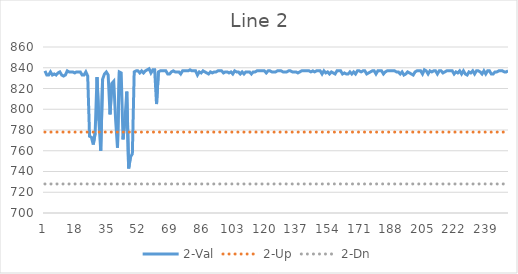
| Category | 2-Val | 2-Up | 2-Dn |
|---|---|---|---|
| 0 | 837 | 778 | 728 |
| 1 | 833 | 778 | 728 |
| 2 | 833 | 778 | 728 |
| 3 | 836 | 778 | 728 |
| 4 | 833 | 778 | 728 |
| 5 | 834 | 778 | 728 |
| 6 | 833 | 778 | 728 |
| 7 | 835 | 778 | 728 |
| 8 | 836 | 778 | 728 |
| 9 | 833 | 778 | 728 |
| 10 | 832 | 778 | 728 |
| 11 | 833 | 778 | 728 |
| 12 | 837 | 778 | 728 |
| 13 | 836 | 778 | 728 |
| 14 | 836 | 778 | 728 |
| 15 | 836 | 778 | 728 |
| 16 | 835 | 778 | 728 |
| 17 | 836 | 778 | 728 |
| 18 | 836 | 778 | 728 |
| 19 | 836 | 778 | 728 |
| 20 | 833 | 778 | 728 |
| 21 | 833 | 778 | 728 |
| 22 | 836 | 778 | 728 |
| 23 | 832 | 778 | 728 |
| 24 | 774 | 778 | 728 |
| 25 | 773 | 778 | 728 |
| 26 | 766 | 778 | 728 |
| 27 | 777 | 778 | 728 |
| 28 | 831 | 778 | 728 |
| 29 | 789 | 778 | 728 |
| 30 | 760 | 778 | 728 |
| 31 | 829 | 778 | 728 |
| 32 | 834 | 778 | 728 |
| 33 | 836 | 778 | 728 |
| 34 | 833 | 778 | 728 |
| 35 | 795 | 778 | 728 |
| 36 | 825 | 778 | 728 |
| 37 | 827 | 778 | 728 |
| 38 | 790 | 778 | 728 |
| 39 | 763 | 778 | 728 |
| 40 | 836 | 778 | 728 |
| 41 | 835 | 778 | 728 |
| 42 | 771 | 778 | 728 |
| 43 | 789 | 778 | 728 |
| 44 | 817 | 778 | 728 |
| 45 | 743 | 778 | 728 |
| 46 | 754 | 778 | 728 |
| 47 | 757 | 778 | 728 |
| 48 | 836 | 778 | 728 |
| 49 | 837 | 778 | 728 |
| 50 | 837 | 778 | 728 |
| 51 | 835 | 778 | 728 |
| 52 | 837 | 778 | 728 |
| 53 | 835 | 778 | 728 |
| 54 | 837 | 778 | 728 |
| 55 | 838 | 778 | 728 |
| 56 | 839 | 778 | 728 |
| 57 | 835 | 778 | 728 |
| 58 | 838 | 778 | 728 |
| 59 | 838 | 778 | 728 |
| 60 | 805 | 778 | 728 |
| 61 | 836 | 778 | 728 |
| 62 | 837 | 778 | 728 |
| 63 | 837 | 778 | 728 |
| 64 | 837 | 778 | 728 |
| 65 | 837 | 778 | 728 |
| 66 | 834 | 778 | 728 |
| 67 | 834 | 778 | 728 |
| 68 | 836 | 778 | 728 |
| 69 | 837 | 778 | 728 |
| 70 | 836 | 778 | 728 |
| 71 | 836 | 778 | 728 |
| 72 | 836 | 778 | 728 |
| 73 | 834 | 778 | 728 |
| 74 | 837 | 778 | 728 |
| 75 | 837 | 778 | 728 |
| 76 | 837 | 778 | 728 |
| 77 | 837 | 778 | 728 |
| 78 | 838 | 778 | 728 |
| 79 | 837 | 778 | 728 |
| 80 | 837 | 778 | 728 |
| 81 | 837 | 778 | 728 |
| 82 | 833 | 778 | 728 |
| 83 | 836 | 778 | 728 |
| 84 | 835 | 778 | 728 |
| 85 | 837 | 778 | 728 |
| 86 | 836 | 778 | 728 |
| 87 | 835 | 778 | 728 |
| 88 | 834 | 778 | 728 |
| 89 | 836 | 778 | 728 |
| 90 | 835 | 778 | 728 |
| 91 | 836 | 778 | 728 |
| 92 | 836 | 778 | 728 |
| 93 | 837 | 778 | 728 |
| 94 | 837 | 778 | 728 |
| 95 | 837 | 778 | 728 |
| 96 | 835 | 778 | 728 |
| 97 | 836 | 778 | 728 |
| 98 | 836 | 778 | 728 |
| 99 | 835 | 778 | 728 |
| 100 | 836 | 778 | 728 |
| 101 | 834 | 778 | 728 |
| 102 | 837 | 778 | 728 |
| 103 | 836 | 778 | 728 |
| 104 | 836 | 778 | 728 |
| 105 | 834 | 778 | 728 |
| 106 | 836 | 778 | 728 |
| 107 | 834 | 778 | 728 |
| 108 | 836 | 778 | 728 |
| 109 | 836 | 778 | 728 |
| 110 | 836 | 778 | 728 |
| 111 | 834 | 778 | 728 |
| 112 | 836 | 778 | 728 |
| 113 | 836 | 778 | 728 |
| 114 | 837 | 778 | 728 |
| 115 | 837 | 778 | 728 |
| 116 | 837 | 778 | 728 |
| 117 | 837 | 778 | 728 |
| 118 | 837 | 778 | 728 |
| 119 | 835 | 778 | 728 |
| 120 | 837 | 778 | 728 |
| 121 | 837 | 778 | 728 |
| 122 | 836 | 778 | 728 |
| 123 | 836 | 778 | 728 |
| 124 | 836 | 778 | 728 |
| 125 | 837 | 778 | 728 |
| 126 | 837 | 778 | 728 |
| 127 | 837 | 778 | 728 |
| 128 | 836 | 778 | 728 |
| 129 | 836 | 778 | 728 |
| 130 | 836 | 778 | 728 |
| 131 | 837 | 778 | 728 |
| 132 | 837 | 778 | 728 |
| 133 | 836 | 778 | 728 |
| 134 | 836 | 778 | 728 |
| 135 | 836 | 778 | 728 |
| 136 | 835 | 778 | 728 |
| 137 | 836 | 778 | 728 |
| 138 | 837 | 778 | 728 |
| 139 | 837 | 778 | 728 |
| 140 | 837 | 778 | 728 |
| 141 | 837 | 778 | 728 |
| 142 | 837 | 778 | 728 |
| 143 | 836 | 778 | 728 |
| 144 | 837 | 778 | 728 |
| 145 | 836 | 778 | 728 |
| 146 | 837 | 778 | 728 |
| 147 | 837 | 778 | 728 |
| 148 | 837 | 778 | 728 |
| 149 | 834 | 778 | 728 |
| 150 | 837 | 778 | 728 |
| 151 | 835 | 778 | 728 |
| 152 | 836 | 778 | 728 |
| 153 | 834 | 778 | 728 |
| 154 | 836 | 778 | 728 |
| 155 | 835 | 778 | 728 |
| 156 | 834 | 778 | 728 |
| 157 | 837 | 778 | 728 |
| 158 | 837 | 778 | 728 |
| 159 | 837 | 778 | 728 |
| 160 | 834 | 778 | 728 |
| 161 | 835 | 778 | 728 |
| 162 | 834 | 778 | 728 |
| 163 | 834 | 778 | 728 |
| 164 | 836 | 778 | 728 |
| 165 | 834 | 778 | 728 |
| 166 | 836 | 778 | 728 |
| 167 | 834 | 778 | 728 |
| 168 | 837 | 778 | 728 |
| 169 | 837 | 778 | 728 |
| 170 | 836 | 778 | 728 |
| 171 | 837 | 778 | 728 |
| 172 | 837 | 778 | 728 |
| 173 | 834 | 778 | 728 |
| 174 | 835 | 778 | 728 |
| 175 | 836 | 778 | 728 |
| 176 | 837 | 778 | 728 |
| 177 | 837 | 778 | 728 |
| 178 | 834 | 778 | 728 |
| 179 | 837 | 778 | 728 |
| 180 | 837 | 778 | 728 |
| 181 | 837 | 778 | 728 |
| 182 | 834 | 778 | 728 |
| 183 | 836 | 778 | 728 |
| 184 | 837 | 778 | 728 |
| 185 | 837 | 778 | 728 |
| 186 | 837 | 778 | 728 |
| 187 | 837 | 778 | 728 |
| 188 | 837 | 778 | 728 |
| 189 | 836 | 778 | 728 |
| 190 | 836 | 778 | 728 |
| 191 | 834 | 778 | 728 |
| 192 | 836 | 778 | 728 |
| 193 | 833 | 778 | 728 |
| 194 | 834 | 778 | 728 |
| 195 | 836 | 778 | 728 |
| 196 | 835 | 778 | 728 |
| 197 | 834 | 778 | 728 |
| 198 | 833 | 778 | 728 |
| 199 | 836 | 778 | 728 |
| 200 | 837 | 778 | 728 |
| 201 | 837 | 778 | 728 |
| 202 | 837 | 778 | 728 |
| 203 | 834 | 778 | 728 |
| 204 | 838 | 778 | 728 |
| 205 | 837 | 778 | 728 |
| 206 | 834 | 778 | 728 |
| 207 | 837 | 778 | 728 |
| 208 | 836 | 778 | 728 |
| 209 | 837 | 778 | 728 |
| 210 | 837 | 778 | 728 |
| 211 | 834 | 778 | 728 |
| 212 | 837 | 778 | 728 |
| 213 | 837 | 778 | 728 |
| 214 | 835 | 778 | 728 |
| 215 | 836 | 778 | 728 |
| 216 | 837 | 778 | 728 |
| 217 | 837 | 778 | 728 |
| 218 | 837 | 778 | 728 |
| 219 | 837 | 778 | 728 |
| 220 | 834 | 778 | 728 |
| 221 | 836 | 778 | 728 |
| 222 | 835 | 778 | 728 |
| 223 | 837 | 778 | 728 |
| 224 | 834 | 778 | 728 |
| 225 | 837 | 778 | 728 |
| 226 | 834 | 778 | 728 |
| 227 | 833 | 778 | 728 |
| 228 | 836 | 778 | 728 |
| 229 | 835 | 778 | 728 |
| 230 | 837 | 778 | 728 |
| 231 | 834 | 778 | 728 |
| 232 | 837 | 778 | 728 |
| 233 | 837 | 778 | 728 |
| 234 | 836 | 778 | 728 |
| 235 | 834 | 778 | 728 |
| 236 | 837 | 778 | 728 |
| 237 | 834 | 778 | 728 |
| 238 | 837 | 778 | 728 |
| 239 | 837 | 778 | 728 |
| 240 | 834 | 778 | 728 |
| 241 | 834 | 778 | 728 |
| 242 | 836 | 778 | 728 |
| 243 | 836 | 778 | 728 |
| 244 | 837 | 778 | 728 |
| 245 | 837 | 778 | 728 |
| 246 | 837 | 778 | 728 |
| 247 | 836 | 778 | 728 |
| 248 | 836 | 778 | 728 |
| 249 | 837 | 778 | 728 |